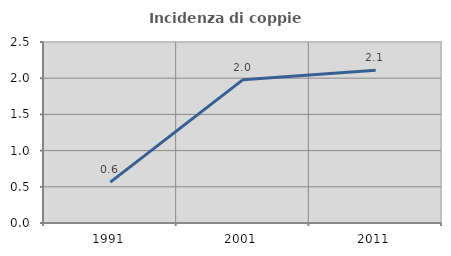
| Category | Incidenza di coppie miste |
|---|---|
| 1991.0 | 0.564 |
| 2001.0 | 1.98 |
| 2011.0 | 2.11 |